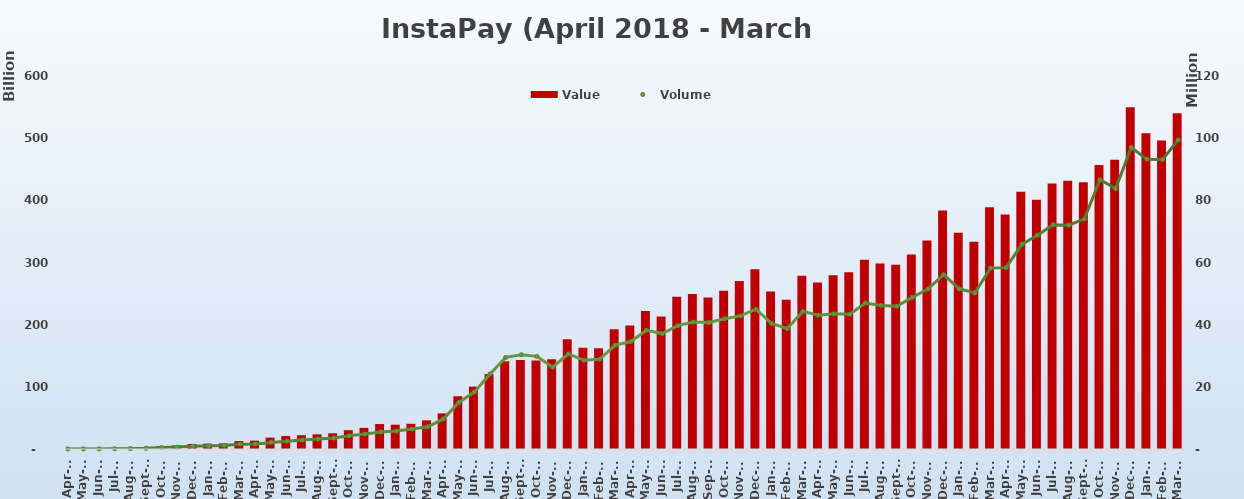
| Category | Value |
|---|---|
| Apr-18 | 19119357.65 |
| May-18 | 190909863.98 |
| Jun-18 | 436073579.61 |
| Jul-18 | 813040844.97 |
| Aug-18 | 1221861342.04 |
| Sep-18 | 2807750427.75 |
| Oct-18 | 4824317595.28 |
| Nov-18 | 5789707597.02 |
| Dec-18 | 8049225571.76 |
| Jan-19 | 8649155972.59 |
| Feb-19 | 9059050504.98 |
| Mar-19 | 12769203028.64 |
| Apr-19 | 13459701557.49 |
| May-19 | 18328222136.29 |
| Jun-19 | 20877838608.55 |
| Jul-19 | 22212767337.01 |
| Aug-19 | 23562872883.86 |
| Sep-19 | 25320395792.64 |
| Oct-19 | 30328558442.65 |
| Nov-19 | 33967999835.53 |
| Dec-19 | 40097407826.53 |
| Jan-20 | 39085129490.35 |
| Feb-20 | 40552145217.46 |
| Mar-20 | 46138110453.61 |
| Apr-20 | 57286070855.73 |
| May-20 | 84921749402.93 |
| Jun-20 | 100313397162.45 |
| Jul-20 | 120462039840.47 |
| Aug-20 | 141204112261.15 |
| Sep-20 | 143228698135.05 |
| Oct-20 | 142550293116.9 |
| Nov-20 | 144384348482.99 |
| Dec-20 | 176470177243.47 |
| Jan-21 | 162713416281.59 |
| Feb-21 | 162043692186.55 |
| Mar-21 | 192564102235.5 |
| Apr-21 | 198839079277.69 |
| May-21 | 221857693271.64 |
| Jun-21 | 213233971792.7 |
| Jul-21 | 244742590971.11 |
| Aug-21 | 249179087992.77 |
| Sep-21 | 243610703774.92 |
| Oct-21 | 254663237245.85 |
| Nov-21 | 270229838772.91 |
| Dec-21 | 289159923228.83 |
| Jan-22 | 253347824224.68 |
| Feb-22 | 240149250173.79 |
| Mar-22 | 278814745766.51 |
| Apr-22 | 267705936308.89 |
| May-22 | 279598943654.34 |
| Jun-22 | 284206626547.48 |
| Jul-22 | 304233846076.08 |
| Aug-22 | 298532114372.12 |
| Sep-22 | 296566935226.22 |
| Oct-22 | 312875691045.3 |
| Nov-22 | 335475621034.1 |
| Dec-22 | 383777480822.24 |
| Jan-23 | 347964775588.78 |
| Feb-23 | 333244155464 |
| Mar-23 | 388949984922.14 |
| Apr-23 | 377229983064.59 |
| May-23 | 413829382366.98 |
| Jun-23 | 400856725259.63 |
| Jul-23 | 426938540730.8 |
| Aug-23 | 431326450222.19 |
| Sep-23 | 429257892307.55 |
| Oct-23 | 457024280204.14 |
| Nov-23 | 465198493932.86 |
| Dec-23 | 549654919616.67 |
| Jan-24 | 507760570598.21 |
| Feb-24 | 496315654109.04 |
| Mar-24 | 540140487828.97 |